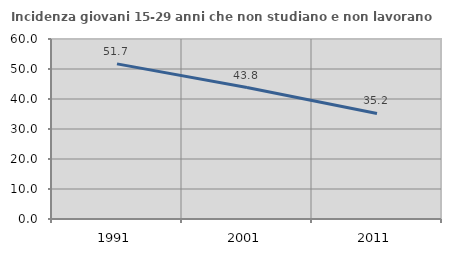
| Category | Incidenza giovani 15-29 anni che non studiano e non lavorano  |
|---|---|
| 1991.0 | 51.711 |
| 2001.0 | 43.82 |
| 2011.0 | 35.193 |